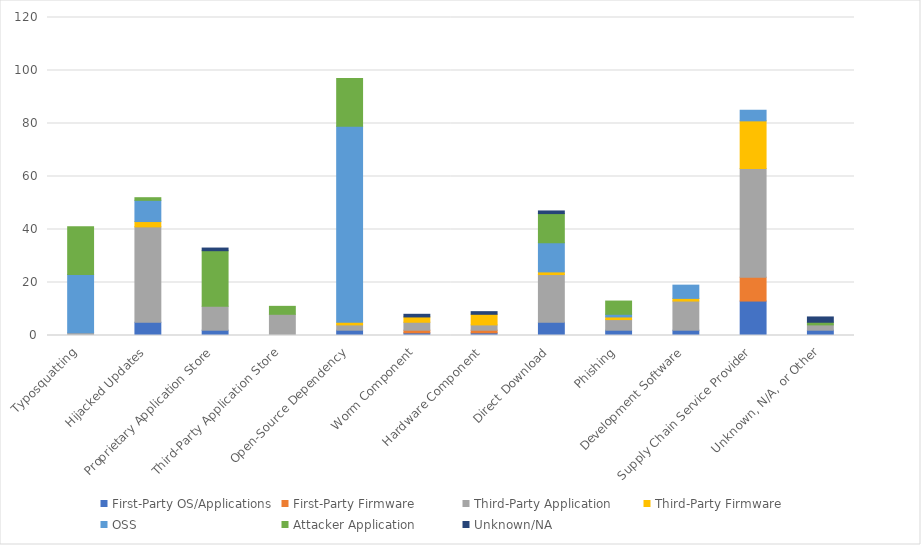
| Category | First-Party OS/Applications | First-Party Firmware | Third-Party Application | Third-Party Firmware | OSS | Attacker Application | Unknown/NA |
|---|---|---|---|---|---|---|---|
| Typosquatting | 0 | 0 | 1 | 0 | 22 | 18 | 0 |
| Hijacked Updates | 5 | 0 | 36 | 2 | 8 | 1 | 0 |
| Proprietary Application Store | 2 | 0 | 9 | 0 | 0 | 21 | 1 |
| Third-Party Application Store | 0 | 0 | 8 | 0 | 0 | 3 | 0 |
| Open-Source Dependency | 2 | 0 | 2 | 1 | 74 | 18 | 0 |
| Worm Component | 1 | 1 | 3 | 2 | 0 | 0 | 1 |
| Hardware Component | 1 | 1 | 2 | 4 | 0 | 0 | 1 |
| Direct Download | 5 | 0 | 18 | 1 | 11 | 11 | 1 |
| Phishing | 2 | 0 | 4 | 1 | 1 | 5 | 0 |
| Development Software | 2 | 0 | 11 | 1 | 5 | 0 | 0 |
| Supply Chain Service Provider | 13 | 9 | 41 | 18 | 4 | 0 | 0 |
| Unknown, N/A, or Other | 2 | 0 | 2 | 0 | 0 | 1 | 2 |